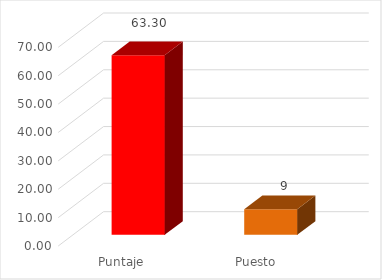
| Category | Series 0 |
|---|---|
| Puntaje  | 63.3 |
| Puesto | 9 |